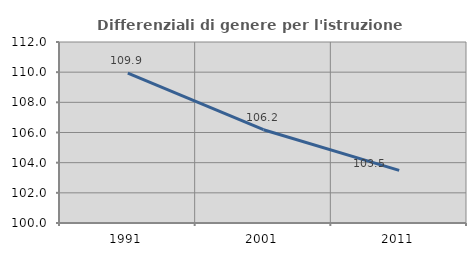
| Category | Differenziali di genere per l'istruzione superiore |
|---|---|
| 1991.0 | 109.931 |
| 2001.0 | 106.184 |
| 2011.0 | 103.489 |